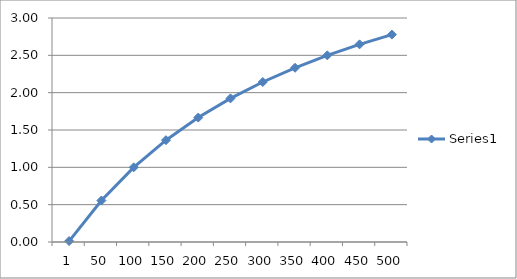
| Category | Series 0 |
|---|---|
| 1.0 | 0.012 |
| 50.0 | 0.556 |
| 100.0 | 1 |
| 150.0 | 1.364 |
| 200.0 | 1.667 |
| 250.0 | 1.923 |
| 300.0 | 2.143 |
| 350.0 | 2.333 |
| 400.0 | 2.5 |
| 450.0 | 2.647 |
| 500.0 | 2.778 |